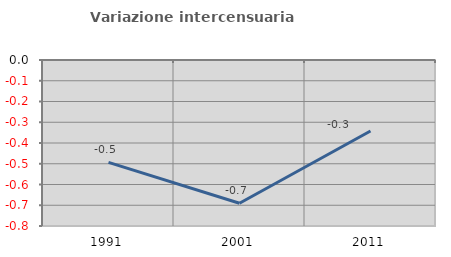
| Category | Variazione intercensuaria annua |
|---|---|
| 1991.0 | -0.493 |
| 2001.0 | -0.69 |
| 2011.0 | -0.342 |